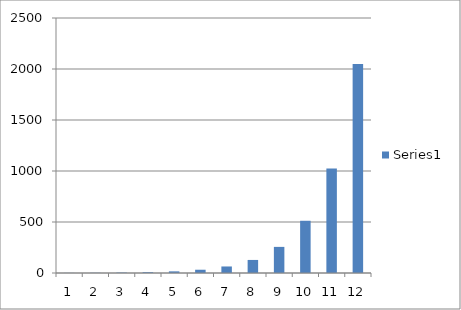
| Category | Series 0 |
|---|---|
| 0 | 1 |
| 1 | 2 |
| 2 | 4 |
| 3 | 8 |
| 4 | 16 |
| 5 | 32 |
| 6 | 64 |
| 7 | 128 |
| 8 | 256 |
| 9 | 512 |
| 10 | 1024 |
| 11 | 2048 |